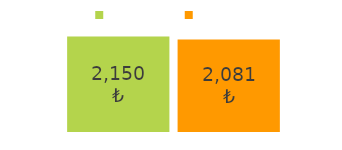
| Category | gelen | giden |
|---|---|---|
| gelen para: | 2150 | 2081 |